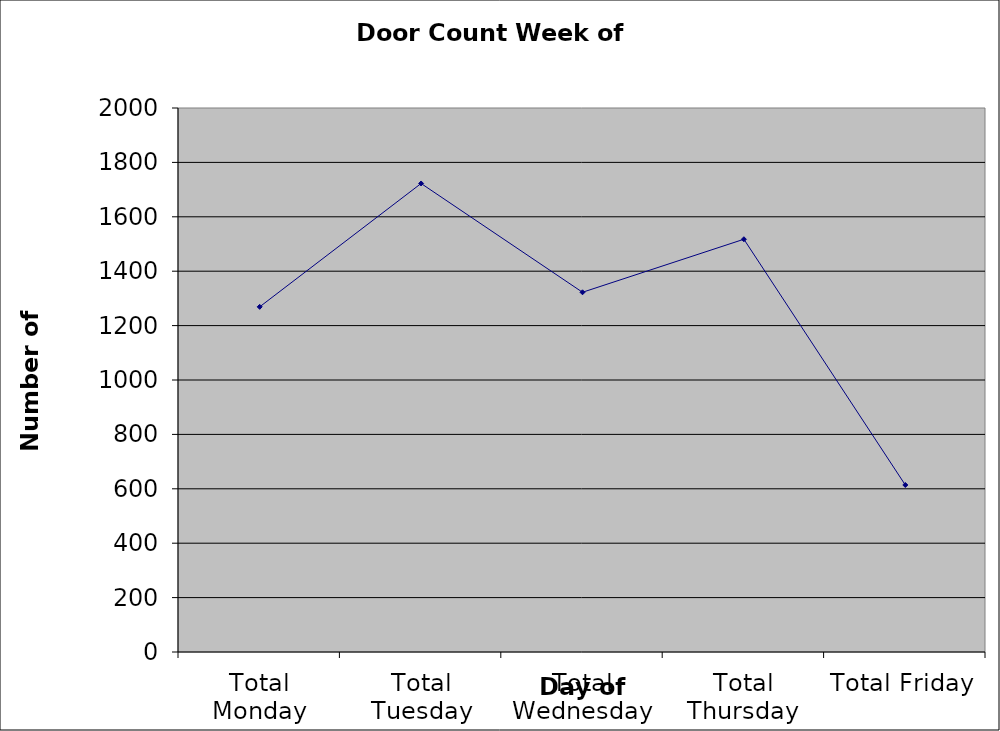
| Category | Series 0 |
|---|---|
| Total Monday | 1269 |
| Total Tuesday | 1722.5 |
| Total Wednesday | 1322.5 |
| Total Thursday | 1517.5 |
| Total Friday | 614 |